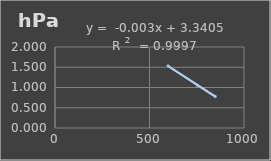
| Category | Presión Atmosférica |
|---|---|
| 598.032 | 1.534 |
| 752.713 | 1.055 |
| 848.5 | 0.778 |